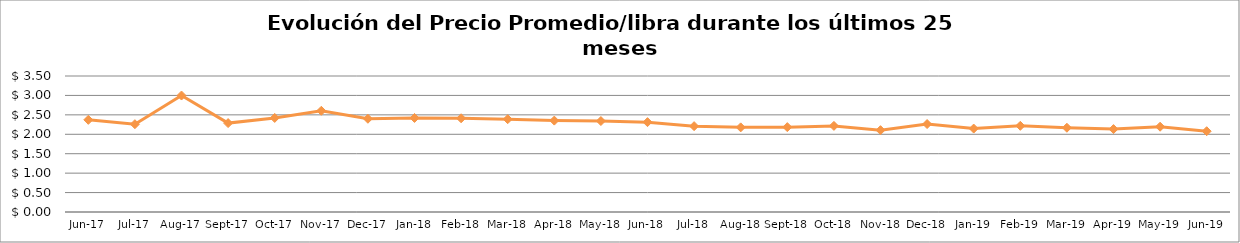
| Category | Series 0 |
|---|---|
| 2017-06-01 | 2.372 |
| 2017-07-01 | 2.26 |
| 2017-08-01 | 2.997 |
| 2017-09-01 | 2.288 |
| 2017-10-01 | 2.421 |
| 2017-11-01 | 2.605 |
| 2017-12-01 | 2.4 |
| 2018-01-01 | 2.42 |
| 2018-02-01 | 2.412 |
| 2018-03-01 | 2.388 |
| 2018-04-01 | 2.352 |
| 2018-05-01 | 2.341 |
| 2018-06-01 | 2.312 |
| 2018-07-01 | 2.209 |
| 2018-08-01 | 2.178 |
| 2018-09-01 | 2.184 |
| 2018-10-01 | 2.216 |
| 2018-11-01 | 2.106 |
| 2018-12-01 | 2.264 |
| 2019-01-01 | 2.147 |
| 2019-02-01 | 2.218 |
| 2019-03-01 | 2.169 |
| 2019-04-01 | 2.134 |
| 2019-05-01 | 2.195 |
| 2019-06-01 | 2.079 |